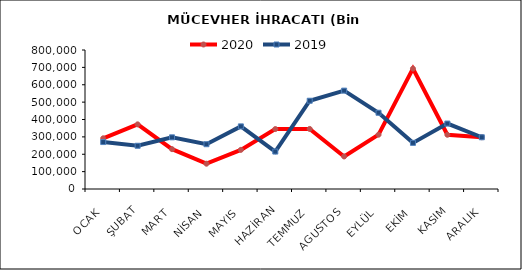
| Category | 2020 | 2019 |
|---|---|---|
| OCAK | 291805.553 | 270232.326 |
| ŞUBAT | 372039.904 | 248780.504 |
| MART | 229282.762 | 297349.991 |
| NİSAN | 145571.756 | 257747.604 |
| MAYIS | 225387.939 | 360377.448 |
| HAZİRAN | 344935.143 | 215410.013 |
| TEMMUZ | 345711.102 | 507955.381 |
| AGUSTOS | 187309.731 | 566132.392 |
| EYLÜL | 312679.012 | 438813.721 |
| EKİM | 692739.527 | 265495.157 |
| KASIM | 312224.713 | 376583.941 |
| ARALIK | 298057.028 | 297820.055 |